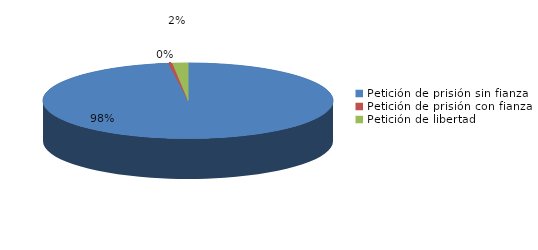
| Category | Series 0 |
|---|---|
| Petición de prisión sin fianza | 226 |
| Petición de prisión con fianza | 1 |
| Petición de libertad | 4 |